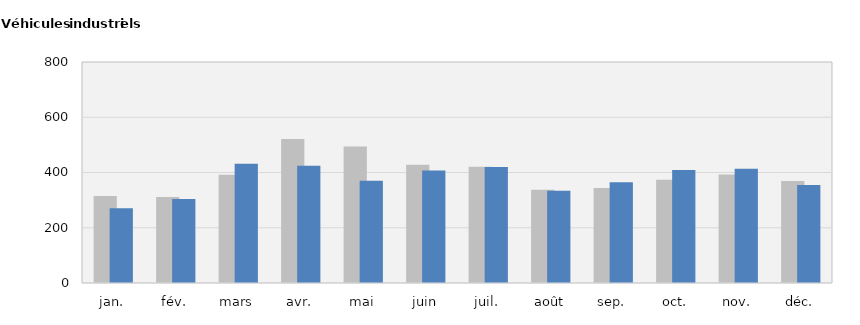
| Category | 2019 | 2020 |
|---|---|---|
| jan. | 315 | 271 |
| fév. | 311 | 304 |
| mars | 392 | 432 |
| avr. | 521 | 424 |
| mai | 494 | 370 |
| juin | 428 | 407 |
| juil. | 421 | 420 |
| août | 338 | 334 |
| sep. | 344 | 365 |
| oct. | 374 | 409 |
| nov. | 393 | 414 |
| déc. | 369 | 355 |